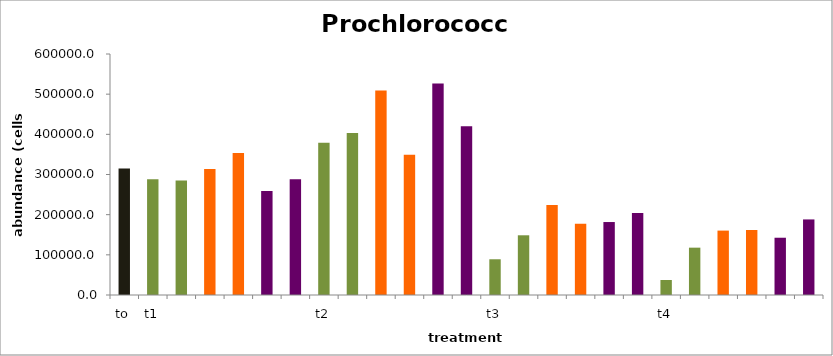
| Category | Series 0 |
|---|---|
| to | 315080.341 |
| t1 | 288111.794 |
|  | 285335.521 |
|  | 313929.018 |
|  | 353604.519 |
|  | 259087.33 |
|  | 287933.352 |
| t2 | 378738.749 |
|  | 403480.352 |
|  | 508938.179 |
|  | 348964.399 |
|  | 526738.768 |
|  | 420374.414 |
| t3 | 88958.744 |
|  | 148655.905 |
|  | 224028.107 |
|  | 177425.986 |
|  | 181657.62 |
|  | 204371.842 |
| t4 | 37366.483 |